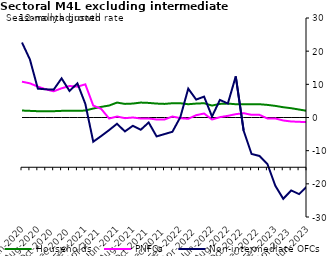
| Category | zero | Households | PNFCs | Non-intermediate OFCs |
|---|---|---|---|---|
| Jun-2020 | 0 | 2.1 | 10.8 | 22.6 |
| Jul-2020 | 0 | 2 | 10.3 | 17.5 |
| Aug-2020 | 0 | 1.9 | 9.3 | 8.7 |
| Sep-2020 | 0 | 1.9 | 8.5 | 8.5 |
| Oct-2020 | 0 | 1.9 | 7.9 | 8.4 |
| Nov-2020 | 0 | 2 | 8.8 | 11.8 |
| Dec-2020 | 0 | 2 | 9.5 | 8 |
| Jan-2021 | 0 | 2 | 9.3 | 10.3 |
| Feb-2021 | 0 | 2.1 | 10 | 4.1 |
| Mar-2021 | 0 | 2.7 | 3.6 | -7.3 |
| Apr-2021 | 0 | 3.2 | 2.6 | -5.6 |
| May-2021 | 0 | 3.6 | -0.3 | -3.8 |
| Jun-2021 | 0 | 4.5 | 0.3 | -1.9 |
| Jul-2021 | 0 | 4.1 | -0.2 | -4.2 |
| Aug-2021 | 0 | 4.2 | 0 | -2.5 |
| Sep-2021 | 0 | 4.5 | -0.3 | -3.7 |
| Oct-2021 | 0 | 4.4 | -0.3 | -1.5 |
| Nov-2021 | 0 | 4.2 | -0.6 | -5.7 |
| Dec-2021 | 0 | 4.1 | -0.6 | -5 |
| Jan-2022 | 0 | 4.3 | 0.3 | -4.3 |
| Feb-2022 | 0 | 4.3 | -0.2 | 0.1 |
| Mar-2022 | 0 | 4 | -0.4 | 8.7 |
| Apr-2022 | 0 | 4.2 | 0.7 | 5.4 |
| May-2022 | 0 | 4.3 | 1.2 | 6.3 |
| Jun-2022 | 0 | 3.6 | -0.6 | 0.3 |
| Jul-2022 | 0 | 4.1 | 0.1 | 5.3 |
| Aug-2022 | 0 | 4.2 | 0.5 | 4.2 |
| Sep-2022 | 0 | 4 | 1 | 12.4 |
| Oct-2022 | 0 | 4 | 1.3 | -4 |
| Nov-2022 | 0 | 4 | 0.8 | -11 |
| Dec-2022 | 0 | 4 | 0.8 | -11.6 |
| Jan-2023 | 0 | 3.8 | -0.3 | -14 |
| Feb-2023 | 0 | 3.5 | -0.3 | -20.6 |
| Mar-2023 | 0 | 3.1 | -0.9 | -24.5 |
| Apr-2023 | 0 | 2.8 | -1.2 | -22 |
| May-2023 | 0 | 2.4 | -1.3 | -23.1 |
| Jun-2023 | 0 | 2 | -1.4 | -20.8 |